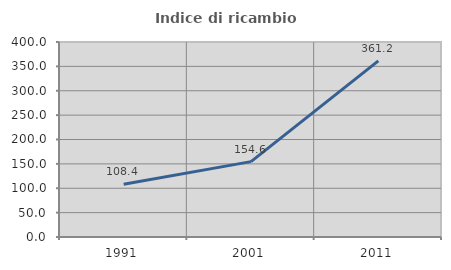
| Category | Indice di ricambio occupazionale  |
|---|---|
| 1991.0 | 108.383 |
| 2001.0 | 154.615 |
| 2011.0 | 361.176 |